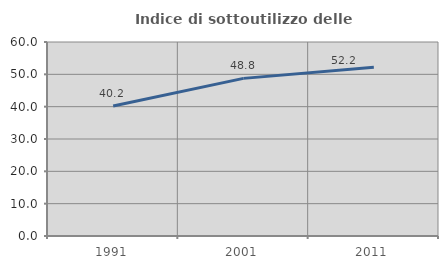
| Category | Indice di sottoutilizzo delle abitazioni  |
|---|---|
| 1991.0 | 40.217 |
| 2001.0 | 48.75 |
| 2011.0 | 52.174 |